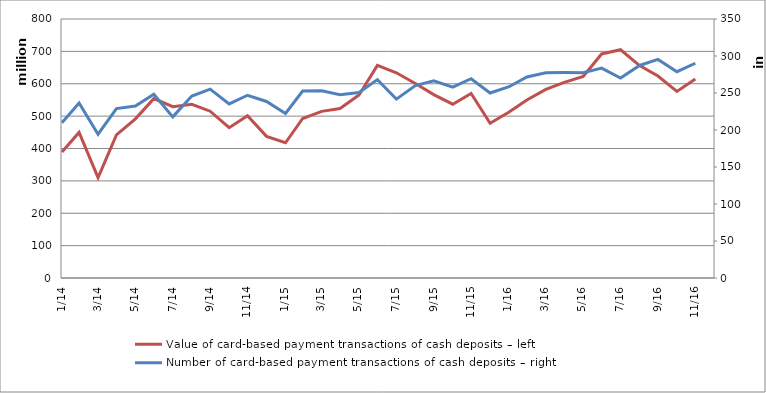
| Category | Value of card-based payment transactions of cash deposits – left |
|---|---|
| 2014-01-01 | 404095097 |
| 2014-02-01 | 389139918 |
| 2014-03-01 | 449761733 |
| 2014-04-01 | 310005125 |
| 2014-05-01 | 441856519 |
| 2014-06-01 | 491734940 |
| 2014-07-01 | 554007087 |
| 2014-08-01 | 529298872 |
| 2014-09-01 | 536620073 |
| 2014-10-01 | 515169584 |
| 2014-11-01 | 464292929 |
| 2014-12-01 | 501162426 |
| 2015-01-01 | 437462560 |
| 2015-02-01 | 417761716 |
| 2015-03-01 | 492701186 |
| 2015-04-01 | 514748639 |
| 2015-05-01 | 523356216 |
| 2015-06-01 | 565057359 |
| 2015-07-01 | 656724490 |
| 2015-08-01 | 633881607 |
| 2015-09-01 | 600851477 |
| 2015-10-01 | 566406333 |
| 2015-11-01 | 536919616 |
| 2015-12-01 | 570165983 |
| 2016-01-01 | 478170461 |
| 2016-02-01 | 512639713 |
| 2016-03-01 | 549693473 |
| 2016-04-01 | 582699966 |
| 2016-05-01 | 604174778 |
| 2016-06-01 | 622450135 |
| 2016-07-01 | 692048756 |
| 2016-08-01 | 705028115 |
| 2016-09-01 | 656237175 |
| 2016-10-01 | 623918776 |
| 2016-11-01 | 576348944 |
| 2016-12-01 | 614910660 |